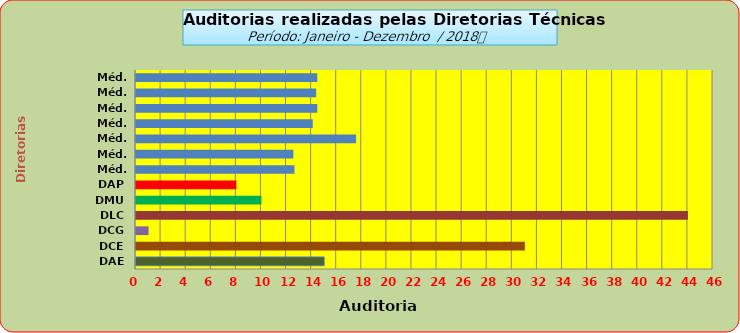
| Category | Series 0 |
|---|---|
| DAE | 15 |
| DCE | 31 |
| DCG | 1 |
| DLC | 44 |
| DMU | 10 |
| DAP | 8 |
| Méd. 2011 | 12.636 |
| Méd. 2012 | 12.545 |
| Méd. 2013 | 17.545 |
| Méd. 2014 | 14.091 |
| Méd. 2015 | 14.455 |
| Méd. 2016 | 14.364 |
| Méd. 2017 | 14.455 |